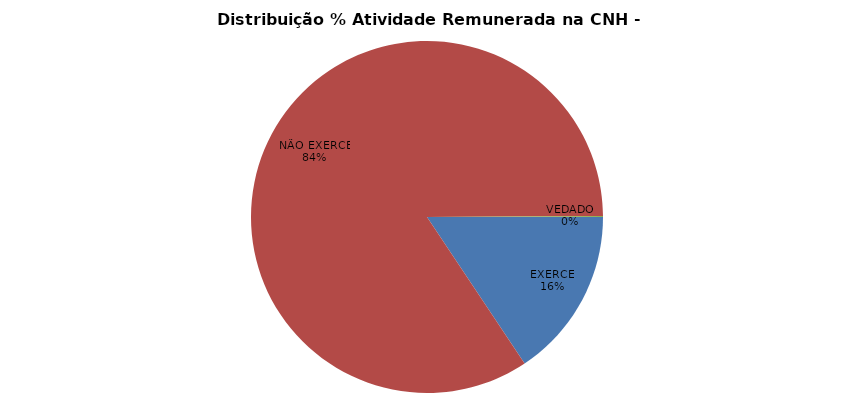
| Category | 2024/Março |
|---|---|
| EXERCE | 856472 |
| NÃO EXERCE | 4614377 |
| VEDADO | 4651 |